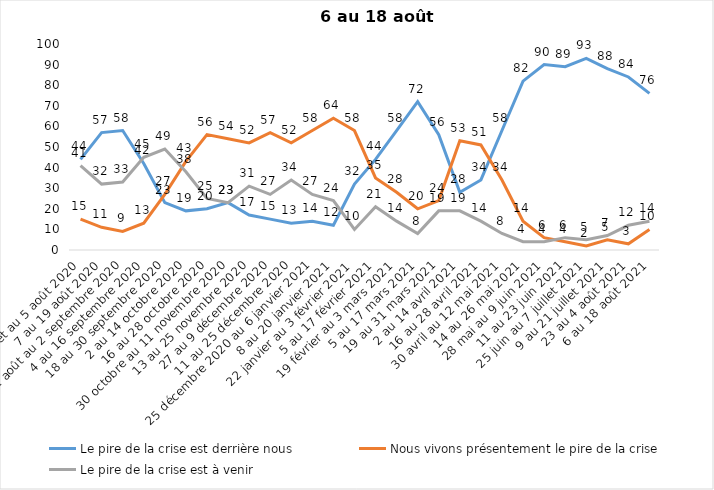
| Category | Le pire de la crise est derrière nous | Nous vivons présentement le pire de la crise | Le pire de la crise est à venir |
|---|---|---|---|
| 24 juillet au 5 août 2020 | 44 | 15 | 41 |
| 7 au 19 août 2020 | 57 | 11 | 32 |
| 21 août au 2 septembre 2020 | 58 | 9 | 33 |
| 4 au 16 septembre 2020 | 42 | 13 | 45 |
| 18 au 30 septembre 2020 | 23 | 27 | 49 |
| 2 au 14 octobre 2020 | 19 | 43 | 38 |
| 16 au 28 octobre 2020 | 20 | 56 | 25 |
| 30 octobre au 11 novembre 2020 | 23 | 54 | 23 |
| 13 au 25 novembre 2020 | 17 | 52 | 31 |
| 27 au 9 décembre 2020 | 15 | 57 | 27 |
| 11 au 25 décembre 2020 | 13 | 52 | 34 |
| 25 décembre 2020 au 6 janvier 2021 | 14 | 58 | 27 |
| 8 au 20 janvier 2021 | 12 | 64 | 24 |
| 22 janvier au 3 février 2021 | 32 | 58 | 10 |
| 5 au 17 février 2021 | 44 | 35 | 21 |
| 19 février au 3 mars 2021 | 58 | 28 | 14 |
| 5 au 17 mars 2021 | 72 | 20 | 8 |
| 19 au 31 mars 2021 | 56 | 24 | 19 |
| 2 au 14 avril 2021 | 28 | 53 | 19 |
| 16 au 28 avril 2021 | 34 | 51 | 14 |
| 30 avril au 12 mai 2021 | 58 | 34 | 8 |
| 14 au 26 mai 2021 | 82 | 14 | 4 |
| 28 mai au 9 juin 2021 | 90 | 6 | 4 |
| 11 au 23 juin 2021 | 89 | 4 | 6 |
| 25 juin au 7 juillet 2021 | 93 | 2 | 5 |
| 9 au 21 juillet 2021 | 88 | 5 | 7 |
| 23 au 4 août 2021 | 84 | 3 | 12 |
| 6 au 18 août 2021 | 76 | 10 | 14 |